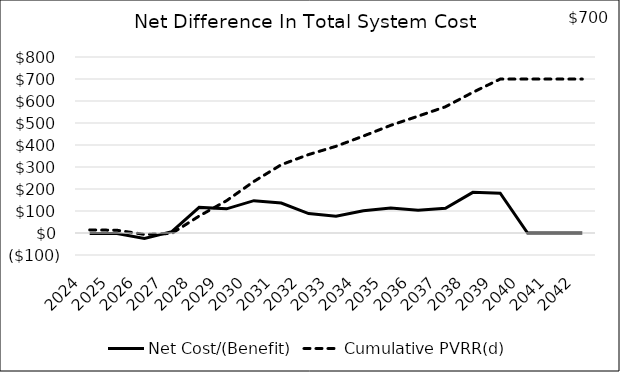
| Category | Net Cost/(Benefit) | Cumulative PVRR(d) |
|---|---|---|
| 2024.0 | -2.277 | 14.067 |
| 2025.0 | -1.974 | 12.442 |
| 2026.0 | -24.355 | -6.355 |
| 2027.0 | 6.094 | -1.947 |
| 2028.0 | 116.431 | 76.998 |
| 2029.0 | 109.778 | 146.765 |
| 2030.0 | 146.945 | 234.297 |
| 2031.0 | 136.296 | 310.394 |
| 2032.0 | 88.327 | 356.617 |
| 2033.0 | 76.472 | 394.126 |
| 2034.0 | 101.015 | 440.567 |
| 2035.0 | 113.499 | 489.475 |
| 2036.0 | 103.313 | 531.203 |
| 2037.0 | 112.495 | 573.79 |
| 2038.0 | 184.824 | 639.371 |
| 2039.0 | 181.144 | 699.616 |
| 2040.0 | -0.188 | 699.558 |
| 2041.0 | 0.083 | 699.582 |
| 2042.0 | 0.135 | 699.619 |